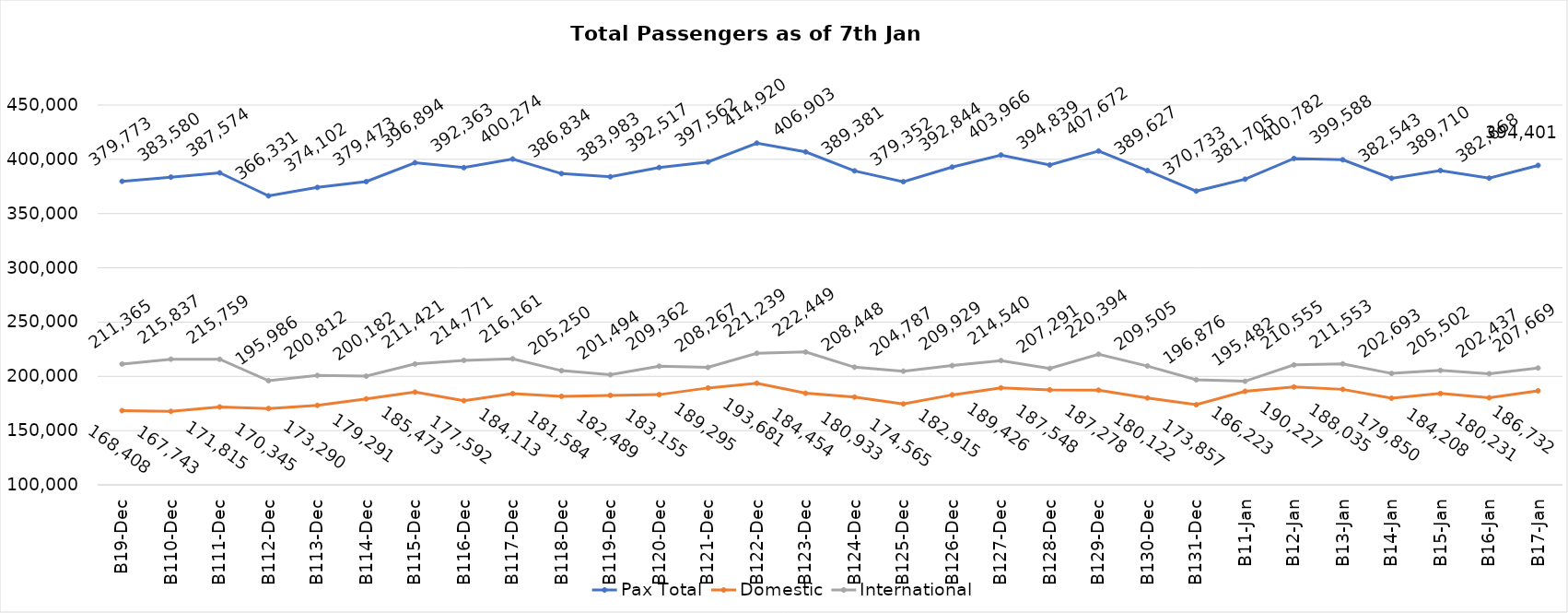
| Category | Pax Total | Domestic | International |
|---|---|---|---|
| 2023-12-09 | 379773 | 168408 | 211365 |
| 2023-12-10 | 383580 | 167743 | 215837 |
| 2023-12-11 | 387574 | 171815 | 215759 |
| 2023-12-12 | 366331 | 170345 | 195986 |
| 2023-12-13 | 374102 | 173290 | 200812 |
| 2023-12-14 | 379473 | 179291 | 200182 |
| 2023-12-15 | 396894 | 185473 | 211421 |
| 2023-12-16 | 392363 | 177592 | 214771 |
| 2023-12-17 | 400274 | 184113 | 216161 |
| 2023-12-18 | 386834 | 181584 | 205250 |
| 2023-12-19 | 383983 | 182489 | 201494 |
| 2023-12-20 | 392517 | 183155 | 209362 |
| 2023-12-21 | 397562 | 189295 | 208267 |
| 2023-12-22 | 414920 | 193681 | 221239 |
| 2023-12-23 | 406903 | 184454 | 222449 |
| 2023-12-24 | 389381 | 180933 | 208448 |
| 2023-12-25 | 379352 | 174565 | 204787 |
| 2023-12-26 | 392844 | 182915 | 209929 |
| 2023-12-27 | 403966 | 189426 | 214540 |
| 2023-12-28 | 394839 | 187548 | 207291 |
| 2023-12-29 | 407672 | 187278 | 220394 |
| 2023-12-30 | 389627 | 180122 | 209505 |
| 2023-12-31 | 370733 | 173857 | 196876 |
| 2024-01-01 | 381705 | 186223 | 195482 |
| 2024-01-02 | 400782 | 190227 | 210555 |
| 2024-01-03 | 399588 | 188035 | 211553 |
| 2024-01-04 | 382543 | 179850 | 202693 |
| 2024-01-05 | 389710 | 184208 | 205502 |
| 2024-01-06 | 382668 | 180231 | 202437 |
| 2024-01-07 | 394401 | 186732 | 207669 |